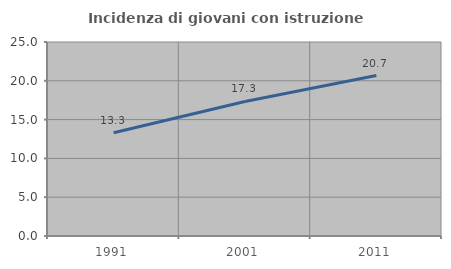
| Category | Incidenza di giovani con istruzione universitaria |
|---|---|
| 1991.0 | 13.298 |
| 2001.0 | 17.34 |
| 2011.0 | 20.676 |